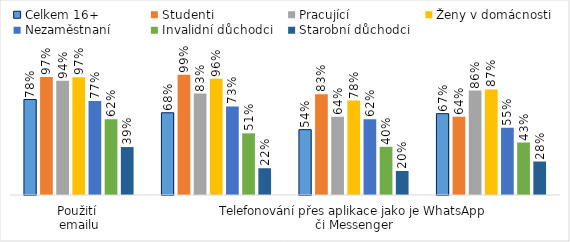
| Category | Celkem 16+ | Studenti | Pracující | Ženy v domácnosti | Nezaměstnaní | Invalidní důchodci | Starobní důchodci |
|---|---|---|---|---|---|---|---|
| Použití 
emailu | 0.785 | 0.969 | 0.938 | 0.969 | 0.772 | 0.623 | 0.394 |
| Zásílání zpráv přes aplikace jako je WhatsApp či Messenger | 0.676 | 0.989 | 0.833 | 0.956 | 0.728 | 0.507 | 0.22 |
| Telefonování přes aplikace jako je WhatsApp či Messenger | 0.537 | 0.828 | 0.643 | 0.776 | 0.622 | 0.396 | 0.197 |
| Použití internetového bankovnictví | 0.668 | 0.643 | 0.858 | 0.868 | 0.552 | 0.431 | 0.275 |